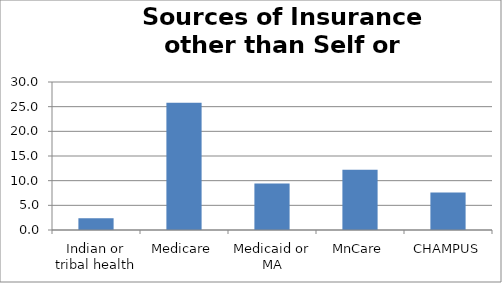
| Category | Series 0 |
|---|---|
| Indian or tribal health | 2.359 |
| Medicare | 25.769 |
| Medicaid or MA | 9.441 |
| MnCare | 12.227 |
| CHAMPUS | 7.622 |